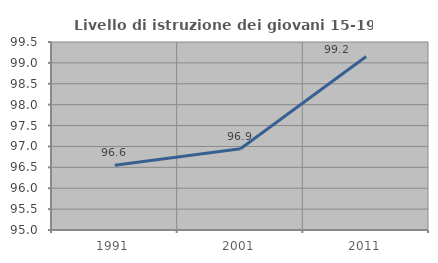
| Category | Livello di istruzione dei giovani 15-19 anni |
|---|---|
| 1991.0 | 96.552 |
| 2001.0 | 96.947 |
| 2011.0 | 99.153 |